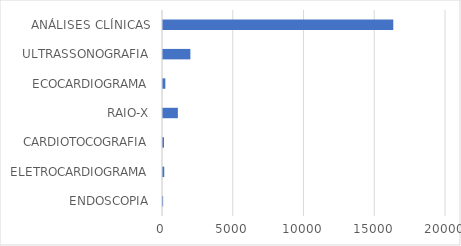
| Category | Series 0 |
|---|---|
| ENDOSCOPIA | 9 |
| ELETROCARDIOGRAMA | 88 |
| CARDIOTOCOGRAFIA | 71 |
| RAIO-X | 1051 |
| ECOCARDIOGRAMA | 166 |
| ULTRASSONOGRAFIA | 1935 |
| ANÁLISES CLÍNICAS | 16274 |